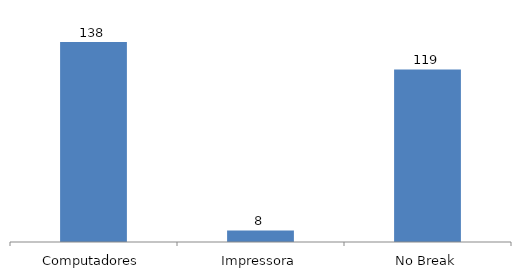
| Category | Series 0 |
|---|---|
| Computadores | 138 |
| Impressora | 8 |
| No Break | 119 |